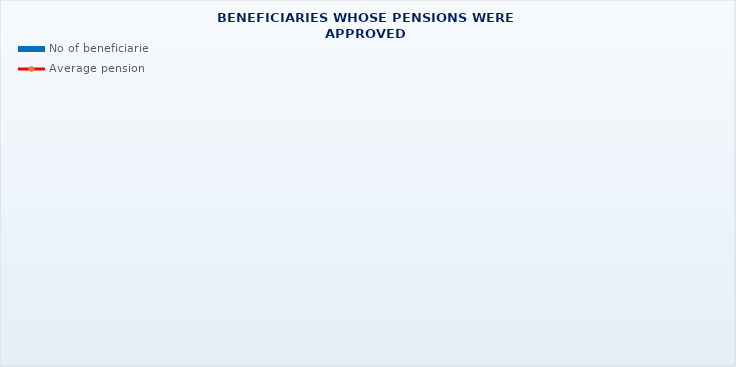
| Category | No of beneficiaries |
|---|---|
| Authorised officials in internal affairs, judicial officers and workers engaged in demining work: | 17264 |
| Active military personnel - DVO  | 15622 |
| Croatian Homeland Army veterans mobilised from 1941 to 1945 | 4046 |
| Former political prisoners | 2802 |
| Croatian Veterans from the Homeland War - ZOHBDR (Act on the Rights of Croatian Homeland War Veterans and their Family Members) | 71211 |
| Pensions approved under general regulations and determined according to the Act on the Rights of Croatian Homeland War Veterans and their Family Members (ZOHBDR), in 2017 (Art. 27, 35, 48 and 49, paragraph 2)    | 42741 |
| Former Yugoslav People's Army members - JNA   | 5407 |
| Former Yugoslav People's Army members - JNA - Art. 185 of Pension Insurance Act (ZOMO)  | 142 |
| National Liberation War veterans - NOR | 9612 |
| Members of the Croatian Parliament, members of the Government, judges of the Constitutional Court and the Auditor General | 673 |
| Members of the Parliamentary Executive Council and administratively retired federal civil servants  (relates to the former SFRY) | 94 |
| Former officials of federal bodies o the former SFRJ -  Article 38 of the Pension Insurance Act (ZOMO) | 33 |
| Full members of the Croatian Academy of Sciences and Arts - HAZU | 140 |
| Miners from the Istrian coal mines "Tupljak" d.d. Labin  | 254 |
| Workers professionally exposed to asbestos | 869 |
| Insurees - crew members on a ship in international and national navigation  - Article  129, paragraph 2 of the Maritime Code | 175 |
| Members of the Croatian Defence Council - HVO  | 6730 |